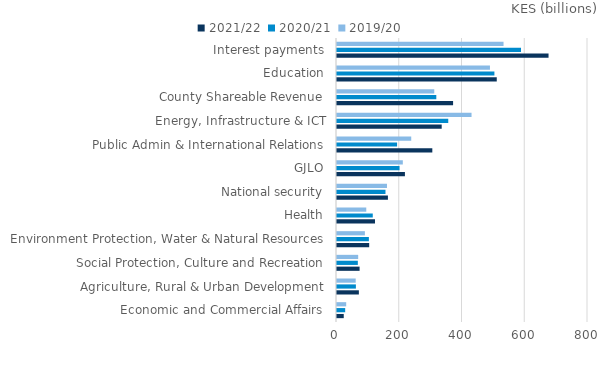
| Category | 2021/22 | 2020/21 | 2019/20 |
|---|---|---|---|
| Economic and Commercial Affairs | 21.5 | 26.1 | 29.3 |
| Agriculture, Rural & Urban Development | 69.7 | 60.2 | 59.6 |
| Social Protection, Culture and Recreation | 72 | 66.4 | 67.5 |
| Environment Protection, Water & Natural Resources | 102.6 | 101.6 | 88.9 |
| Health | 121.1 | 114 | 93.3 |
| National security | 162.3 | 154.5 | 159.3 |
| GJLO | 216.5 | 199.3 | 209.8 |
| Public Admin & International Relations | 303.8 | 191.5 | 236.6 |
| Energy, Infrastructure & ICT | 333.7 | 354.6 | 428.8 |
| County Shareable Revenue | 370 | 316.5 | 310 |
| Education | 509.2 | 501.7 | 487.5 |
| Interest payments | 674.229 | 586.468 | 530.793 |